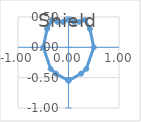
| Category | Shield |
|---|---|
| 0.0 | -0.55 |
| 0.25 | -0.433 |
| 0.3535533905932738 | -0.354 |
| 0.5 | 0 |
| 0.4235533905932738 | 0.304 |
| 0.325 | 0.45 |
| 0.21666666666666667 | 0.42 |
| 0.10833333333333334 | 0.42 |
| 0.0 | 0.45 |
| -0.10833333333333334 | 0.42 |
| -0.21666666666666667 | 0.42 |
| -0.325 | 0.45 |
| -0.4235533905932738 | 0.304 |
| -0.5 | 0 |
| -0.3535533905932738 | -0.354 |
| -0.25 | -0.433 |
| 0.0 | -0.55 |